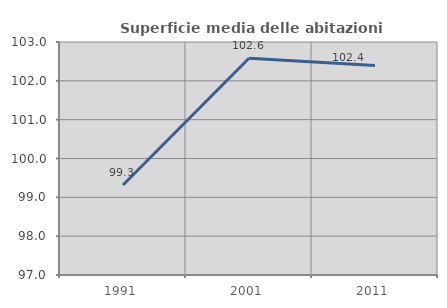
| Category | Superficie media delle abitazioni occupate |
|---|---|
| 1991.0 | 99.318 |
| 2001.0 | 102.581 |
| 2011.0 | 102.393 |